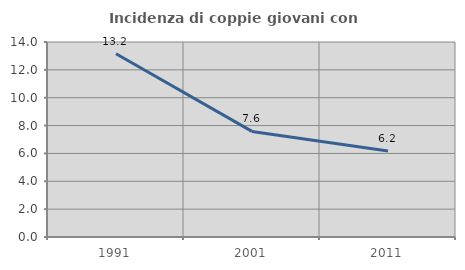
| Category | Incidenza di coppie giovani con figli |
|---|---|
| 1991.0 | 13.159 |
| 2001.0 | 7.58 |
| 2011.0 | 6.178 |